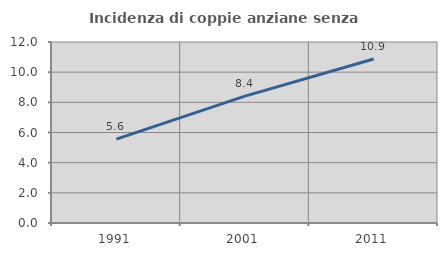
| Category | Incidenza di coppie anziane senza figli  |
|---|---|
| 1991.0 | 5.56 |
| 2001.0 | 8.408 |
| 2011.0 | 10.875 |